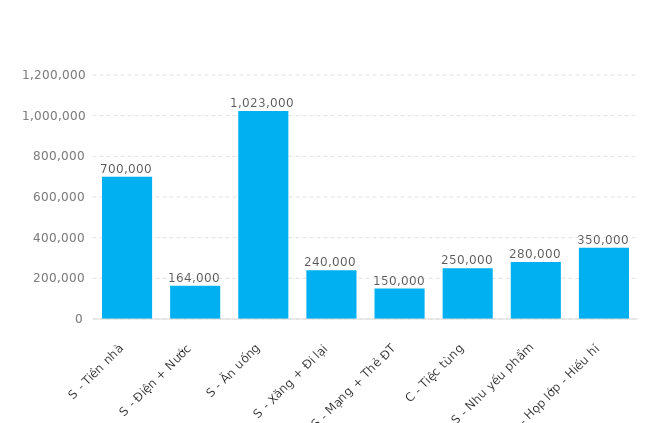
| Category | Total |
|---|---|
| S - Tiền nhà | 700000 |
| S - Điện + Nước | 164000 |
| S - Ăn uống | 1023000 |
| S - Xăng + Đi lại | 240000 |
| S - Mạng + Thẻ ĐT | 150000 |
| C - Tiệc tùng | 250000 |
| S - Nhu yếu phẩm | 280000 |
| C - Họp lớp - Hiếu hỉ | 350000 |